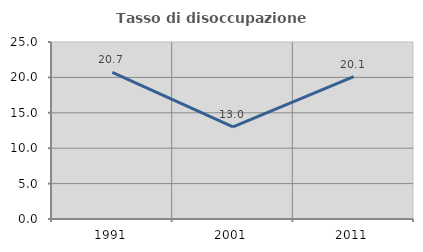
| Category | Tasso di disoccupazione giovanile  |
|---|---|
| 1991.0 | 20.719 |
| 2001.0 | 13.026 |
| 2011.0 | 20.117 |